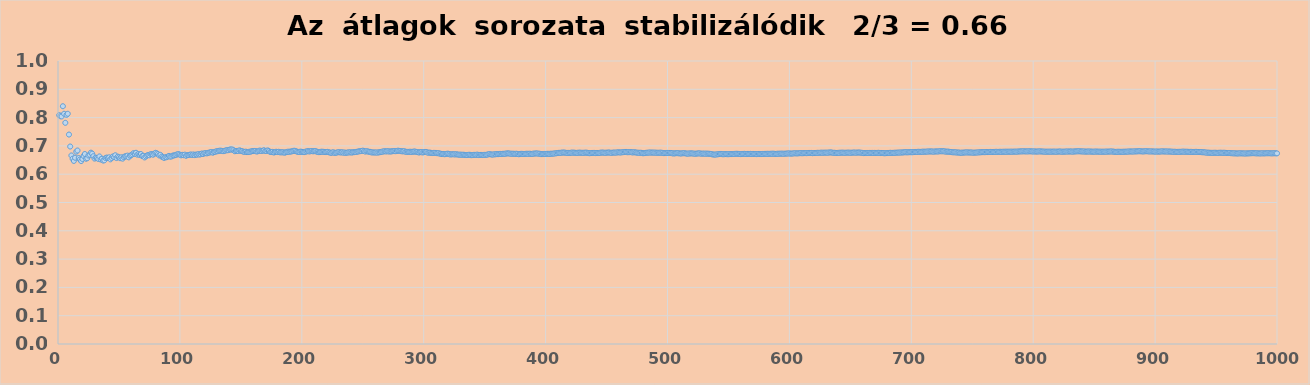
| Category | Series 0 |
|---|---|
| 1.0 | 0.809 |
| 2.0 | 0.805 |
| 3.0 | 0.804 |
| 4.0 | 0.84 |
| 5.0 | 0.814 |
| 6.0 | 0.782 |
| 7.0 | 0.81 |
| 8.0 | 0.814 |
| 9.0 | 0.74 |
| 10.0 | 0.698 |
| 11.0 | 0.666 |
| 12.0 | 0.655 |
| 13.0 | 0.647 |
| 14.0 | 0.658 |
| 15.0 | 0.68 |
| 16.0 | 0.684 |
| 17.0 | 0.657 |
| 18.0 | 0.652 |
| 19.0 | 0.646 |
| 20.0 | 0.654 |
| 21.0 | 0.664 |
| 22.0 | 0.671 |
| 23.0 | 0.655 |
| 24.0 | 0.656 |
| 25.0 | 0.666 |
| 26.0 | 0.669 |
| 27.0 | 0.676 |
| 28.0 | 0.673 |
| 29.0 | 0.663 |
| 30.0 | 0.655 |
| 31.0 | 0.658 |
| 32.0 | 0.657 |
| 33.0 | 0.654 |
| 34.0 | 0.663 |
| 35.0 | 0.652 |
| 36.0 | 0.655 |
| 37.0 | 0.648 |
| 38.0 | 0.649 |
| 39.0 | 0.657 |
| 40.0 | 0.659 |
| 41.0 | 0.657 |
| 42.0 | 0.66 |
| 43.0 | 0.652 |
| 44.0 | 0.657 |
| 45.0 | 0.663 |
| 46.0 | 0.66 |
| 47.0 | 0.667 |
| 48.0 | 0.657 |
| 49.0 | 0.662 |
| 50.0 | 0.66 |
| 51.0 | 0.657 |
| 52.0 | 0.66 |
| 53.0 | 0.655 |
| 54.0 | 0.66 |
| 55.0 | 0.663 |
| 56.0 | 0.663 |
| 57.0 | 0.666 |
| 58.0 | 0.66 |
| 59.0 | 0.665 |
| 60.0 | 0.667 |
| 61.0 | 0.67 |
| 62.0 | 0.674 |
| 63.0 | 0.672 |
| 64.0 | 0.676 |
| 65.0 | 0.669 |
| 66.0 | 0.671 |
| 67.0 | 0.668 |
| 68.0 | 0.671 |
| 69.0 | 0.664 |
| 70.0 | 0.665 |
| 71.0 | 0.659 |
| 72.0 | 0.663 |
| 73.0 | 0.666 |
| 74.0 | 0.668 |
| 75.0 | 0.667 |
| 76.0 | 0.671 |
| 77.0 | 0.671 |
| 78.0 | 0.669 |
| 79.0 | 0.673 |
| 80.0 | 0.676 |
| 81.0 | 0.674 |
| 82.0 | 0.671 |
| 83.0 | 0.666 |
| 84.0 | 0.668 |
| 85.0 | 0.662 |
| 86.0 | 0.66 |
| 87.0 | 0.658 |
| 88.0 | 0.66 |
| 89.0 | 0.66 |
| 90.0 | 0.662 |
| 91.0 | 0.664 |
| 92.0 | 0.662 |
| 93.0 | 0.663 |
| 94.0 | 0.665 |
| 95.0 | 0.666 |
| 96.0 | 0.667 |
| 97.0 | 0.669 |
| 98.0 | 0.67 |
| 99.0 | 0.671 |
| 100.0 | 0.669 |
| 101.0 | 0.667 |
| 102.0 | 0.668 |
| 103.0 | 0.667 |
| 104.0 | 0.669 |
| 105.0 | 0.665 |
| 106.0 | 0.667 |
| 107.0 | 0.668 |
| 108.0 | 0.669 |
| 109.0 | 0.67 |
| 110.0 | 0.668 |
| 111.0 | 0.67 |
| 112.0 | 0.667 |
| 113.0 | 0.669 |
| 114.0 | 0.669 |
| 115.0 | 0.671 |
| 116.0 | 0.669 |
| 117.0 | 0.671 |
| 118.0 | 0.673 |
| 119.0 | 0.671 |
| 120.0 | 0.674 |
| 121.0 | 0.674 |
| 122.0 | 0.674 |
| 123.0 | 0.675 |
| 124.0 | 0.676 |
| 125.0 | 0.678 |
| 126.0 | 0.678 |
| 127.0 | 0.676 |
| 128.0 | 0.678 |
| 129.0 | 0.679 |
| 130.0 | 0.681 |
| 131.0 | 0.681 |
| 132.0 | 0.683 |
| 133.0 | 0.683 |
| 134.0 | 0.683 |
| 135.0 | 0.682 |
| 136.0 | 0.682 |
| 137.0 | 0.683 |
| 138.0 | 0.685 |
| 139.0 | 0.685 |
| 140.0 | 0.685 |
| 141.0 | 0.687 |
| 142.0 | 0.687 |
| 143.0 | 0.687 |
| 144.0 | 0.685 |
| 145.0 | 0.681 |
| 146.0 | 0.682 |
| 147.0 | 0.682 |
| 148.0 | 0.682 |
| 149.0 | 0.684 |
| 150.0 | 0.682 |
| 151.0 | 0.681 |
| 152.0 | 0.68 |
| 153.0 | 0.679 |
| 154.0 | 0.68 |
| 155.0 | 0.678 |
| 156.0 | 0.678 |
| 157.0 | 0.679 |
| 158.0 | 0.68 |
| 159.0 | 0.681 |
| 160.0 | 0.682 |
| 161.0 | 0.682 |
| 162.0 | 0.682 |
| 163.0 | 0.68 |
| 164.0 | 0.681 |
| 165.0 | 0.683 |
| 166.0 | 0.683 |
| 167.0 | 0.682 |
| 168.0 | 0.683 |
| 169.0 | 0.685 |
| 170.0 | 0.682 |
| 171.0 | 0.682 |
| 172.0 | 0.684 |
| 173.0 | 0.682 |
| 174.0 | 0.679 |
| 175.0 | 0.678 |
| 176.0 | 0.679 |
| 177.0 | 0.677 |
| 178.0 | 0.678 |
| 179.0 | 0.679 |
| 180.0 | 0.678 |
| 181.0 | 0.679 |
| 182.0 | 0.677 |
| 183.0 | 0.677 |
| 184.0 | 0.677 |
| 185.0 | 0.677 |
| 186.0 | 0.676 |
| 187.0 | 0.678 |
| 188.0 | 0.679 |
| 189.0 | 0.68 |
| 190.0 | 0.679 |
| 191.0 | 0.68 |
| 192.0 | 0.681 |
| 193.0 | 0.682 |
| 194.0 | 0.683 |
| 195.0 | 0.682 |
| 196.0 | 0.68 |
| 197.0 | 0.679 |
| 198.0 | 0.679 |
| 199.0 | 0.68 |
| 200.0 | 0.679 |
| 201.0 | 0.679 |
| 202.0 | 0.678 |
| 203.0 | 0.679 |
| 204.0 | 0.68 |
| 205.0 | 0.682 |
| 206.0 | 0.68 |
| 207.0 | 0.681 |
| 208.0 | 0.682 |
| 209.0 | 0.681 |
| 210.0 | 0.681 |
| 211.0 | 0.682 |
| 212.0 | 0.68 |
| 213.0 | 0.679 |
| 214.0 | 0.678 |
| 215.0 | 0.678 |
| 216.0 | 0.68 |
| 217.0 | 0.679 |
| 218.0 | 0.679 |
| 219.0 | 0.678 |
| 220.0 | 0.678 |
| 221.0 | 0.679 |
| 222.0 | 0.678 |
| 223.0 | 0.677 |
| 224.0 | 0.675 |
| 225.0 | 0.677 |
| 226.0 | 0.677 |
| 227.0 | 0.675 |
| 228.0 | 0.676 |
| 229.0 | 0.677 |
| 230.0 | 0.678 |
| 231.0 | 0.678 |
| 232.0 | 0.677 |
| 233.0 | 0.678 |
| 234.0 | 0.676 |
| 235.0 | 0.677 |
| 236.0 | 0.675 |
| 237.0 | 0.676 |
| 238.0 | 0.677 |
| 239.0 | 0.677 |
| 240.0 | 0.678 |
| 241.0 | 0.676 |
| 242.0 | 0.678 |
| 243.0 | 0.678 |
| 244.0 | 0.679 |
| 245.0 | 0.679 |
| 246.0 | 0.68 |
| 247.0 | 0.681 |
| 248.0 | 0.681 |
| 249.0 | 0.682 |
| 250.0 | 0.683 |
| 251.0 | 0.682 |
| 252.0 | 0.68 |
| 253.0 | 0.681 |
| 254.0 | 0.681 |
| 255.0 | 0.679 |
| 256.0 | 0.679 |
| 257.0 | 0.677 |
| 258.0 | 0.677 |
| 259.0 | 0.677 |
| 260.0 | 0.677 |
| 261.0 | 0.677 |
| 262.0 | 0.676 |
| 263.0 | 0.677 |
| 264.0 | 0.678 |
| 265.0 | 0.679 |
| 266.0 | 0.68 |
| 267.0 | 0.68 |
| 268.0 | 0.681 |
| 269.0 | 0.68 |
| 270.0 | 0.681 |
| 271.0 | 0.681 |
| 272.0 | 0.68 |
| 273.0 | 0.68 |
| 274.0 | 0.681 |
| 275.0 | 0.682 |
| 276.0 | 0.682 |
| 277.0 | 0.681 |
| 278.0 | 0.682 |
| 279.0 | 0.683 |
| 280.0 | 0.682 |
| 281.0 | 0.682 |
| 282.0 | 0.681 |
| 283.0 | 0.681 |
| 284.0 | 0.681 |
| 285.0 | 0.679 |
| 286.0 | 0.679 |
| 287.0 | 0.679 |
| 288.0 | 0.679 |
| 289.0 | 0.679 |
| 290.0 | 0.679 |
| 291.0 | 0.679 |
| 292.0 | 0.68 |
| 293.0 | 0.68 |
| 294.0 | 0.679 |
| 295.0 | 0.678 |
| 296.0 | 0.677 |
| 297.0 | 0.678 |
| 298.0 | 0.678 |
| 299.0 | 0.677 |
| 300.0 | 0.678 |
| 301.0 | 0.679 |
| 302.0 | 0.679 |
| 303.0 | 0.677 |
| 304.0 | 0.676 |
| 305.0 | 0.676 |
| 306.0 | 0.676 |
| 307.0 | 0.675 |
| 308.0 | 0.675 |
| 309.0 | 0.675 |
| 310.0 | 0.675 |
| 311.0 | 0.674 |
| 312.0 | 0.674 |
| 313.0 | 0.673 |
| 314.0 | 0.672 |
| 315.0 | 0.671 |
| 316.0 | 0.671 |
| 317.0 | 0.671 |
| 318.0 | 0.671 |
| 319.0 | 0.672 |
| 320.0 | 0.672 |
| 321.0 | 0.671 |
| 322.0 | 0.67 |
| 323.0 | 0.67 |
| 324.0 | 0.671 |
| 325.0 | 0.67 |
| 326.0 | 0.67 |
| 327.0 | 0.671 |
| 328.0 | 0.669 |
| 329.0 | 0.669 |
| 330.0 | 0.669 |
| 331.0 | 0.669 |
| 332.0 | 0.669 |
| 333.0 | 0.669 |
| 334.0 | 0.668 |
| 335.0 | 0.668 |
| 336.0 | 0.668 |
| 337.0 | 0.669 |
| 338.0 | 0.669 |
| 339.0 | 0.667 |
| 340.0 | 0.668 |
| 341.0 | 0.668 |
| 342.0 | 0.668 |
| 343.0 | 0.668 |
| 344.0 | 0.669 |
| 345.0 | 0.668 |
| 346.0 | 0.668 |
| 347.0 | 0.668 |
| 348.0 | 0.668 |
| 349.0 | 0.668 |
| 350.0 | 0.668 |
| 351.0 | 0.668 |
| 352.0 | 0.669 |
| 353.0 | 0.67 |
| 354.0 | 0.671 |
| 355.0 | 0.67 |
| 356.0 | 0.669 |
| 357.0 | 0.67 |
| 358.0 | 0.67 |
| 359.0 | 0.67 |
| 360.0 | 0.671 |
| 361.0 | 0.671 |
| 362.0 | 0.672 |
| 363.0 | 0.672 |
| 364.0 | 0.671 |
| 365.0 | 0.672 |
| 366.0 | 0.672 |
| 367.0 | 0.672 |
| 368.0 | 0.673 |
| 369.0 | 0.674 |
| 370.0 | 0.673 |
| 371.0 | 0.672 |
| 372.0 | 0.672 |
| 373.0 | 0.672 |
| 374.0 | 0.672 |
| 375.0 | 0.672 |
| 376.0 | 0.672 |
| 377.0 | 0.672 |
| 378.0 | 0.67 |
| 379.0 | 0.671 |
| 380.0 | 0.672 |
| 381.0 | 0.672 |
| 382.0 | 0.671 |
| 383.0 | 0.672 |
| 384.0 | 0.672 |
| 385.0 | 0.672 |
| 386.0 | 0.672 |
| 387.0 | 0.672 |
| 388.0 | 0.672 |
| 389.0 | 0.672 |
| 390.0 | 0.673 |
| 391.0 | 0.673 |
| 392.0 | 0.673 |
| 393.0 | 0.673 |
| 394.0 | 0.673 |
| 395.0 | 0.672 |
| 396.0 | 0.671 |
| 397.0 | 0.671 |
| 398.0 | 0.671 |
| 399.0 | 0.672 |
| 400.0 | 0.672 |
| 401.0 | 0.672 |
| 402.0 | 0.672 |
| 403.0 | 0.672 |
| 404.0 | 0.672 |
| 405.0 | 0.672 |
| 406.0 | 0.673 |
| 407.0 | 0.673 |
| 408.0 | 0.673 |
| 409.0 | 0.674 |
| 410.0 | 0.675 |
| 411.0 | 0.676 |
| 412.0 | 0.675 |
| 413.0 | 0.676 |
| 414.0 | 0.677 |
| 415.0 | 0.676 |
| 416.0 | 0.676 |
| 417.0 | 0.675 |
| 418.0 | 0.675 |
| 419.0 | 0.675 |
| 420.0 | 0.675 |
| 421.0 | 0.676 |
| 422.0 | 0.676 |
| 423.0 | 0.676 |
| 424.0 | 0.676 |
| 425.0 | 0.675 |
| 426.0 | 0.675 |
| 427.0 | 0.676 |
| 428.0 | 0.676 |
| 429.0 | 0.676 |
| 430.0 | 0.676 |
| 431.0 | 0.676 |
| 432.0 | 0.676 |
| 433.0 | 0.676 |
| 434.0 | 0.676 |
| 435.0 | 0.675 |
| 436.0 | 0.674 |
| 437.0 | 0.675 |
| 438.0 | 0.675 |
| 439.0 | 0.675 |
| 440.0 | 0.675 |
| 441.0 | 0.675 |
| 442.0 | 0.675 |
| 443.0 | 0.675 |
| 444.0 | 0.675 |
| 445.0 | 0.676 |
| 446.0 | 0.677 |
| 447.0 | 0.676 |
| 448.0 | 0.676 |
| 449.0 | 0.676 |
| 450.0 | 0.676 |
| 451.0 | 0.676 |
| 452.0 | 0.677 |
| 453.0 | 0.676 |
| 454.0 | 0.676 |
| 455.0 | 0.676 |
| 456.0 | 0.676 |
| 457.0 | 0.676 |
| 458.0 | 0.677 |
| 459.0 | 0.677 |
| 460.0 | 0.678 |
| 461.0 | 0.677 |
| 462.0 | 0.677 |
| 463.0 | 0.678 |
| 464.0 | 0.678 |
| 465.0 | 0.678 |
| 466.0 | 0.679 |
| 467.0 | 0.678 |
| 468.0 | 0.678 |
| 469.0 | 0.678 |
| 470.0 | 0.678 |
| 471.0 | 0.677 |
| 472.0 | 0.677 |
| 473.0 | 0.678 |
| 474.0 | 0.677 |
| 475.0 | 0.676 |
| 476.0 | 0.676 |
| 477.0 | 0.676 |
| 478.0 | 0.676 |
| 479.0 | 0.675 |
| 480.0 | 0.674 |
| 481.0 | 0.675 |
| 482.0 | 0.675 |
| 483.0 | 0.676 |
| 484.0 | 0.676 |
| 485.0 | 0.677 |
| 486.0 | 0.677 |
| 487.0 | 0.676 |
| 488.0 | 0.676 |
| 489.0 | 0.676 |
| 490.0 | 0.676 |
| 491.0 | 0.676 |
| 492.0 | 0.676 |
| 493.0 | 0.676 |
| 494.0 | 0.676 |
| 495.0 | 0.676 |
| 496.0 | 0.675 |
| 497.0 | 0.674 |
| 498.0 | 0.675 |
| 499.0 | 0.675 |
| 500.0 | 0.675 |
| 501.0 | 0.675 |
| 502.0 | 0.675 |
| 503.0 | 0.675 |
| 504.0 | 0.674 |
| 505.0 | 0.673 |
| 506.0 | 0.674 |
| 507.0 | 0.674 |
| 508.0 | 0.674 |
| 509.0 | 0.674 |
| 510.0 | 0.673 |
| 511.0 | 0.673 |
| 512.0 | 0.674 |
| 513.0 | 0.674 |
| 514.0 | 0.674 |
| 515.0 | 0.673 |
| 516.0 | 0.673 |
| 517.0 | 0.673 |
| 518.0 | 0.673 |
| 519.0 | 0.674 |
| 520.0 | 0.674 |
| 521.0 | 0.673 |
| 522.0 | 0.673 |
| 523.0 | 0.672 |
| 524.0 | 0.673 |
| 525.0 | 0.673 |
| 526.0 | 0.674 |
| 527.0 | 0.673 |
| 528.0 | 0.672 |
| 529.0 | 0.673 |
| 530.0 | 0.673 |
| 531.0 | 0.672 |
| 532.0 | 0.673 |
| 533.0 | 0.672 |
| 534.0 | 0.672 |
| 535.0 | 0.672 |
| 536.0 | 0.671 |
| 537.0 | 0.67 |
| 538.0 | 0.669 |
| 539.0 | 0.669 |
| 540.0 | 0.67 |
| 541.0 | 0.67 |
| 542.0 | 0.671 |
| 543.0 | 0.671 |
| 544.0 | 0.672 |
| 545.0 | 0.671 |
| 546.0 | 0.671 |
| 547.0 | 0.671 |
| 548.0 | 0.671 |
| 549.0 | 0.671 |
| 550.0 | 0.671 |
| 551.0 | 0.671 |
| 552.0 | 0.671 |
| 553.0 | 0.671 |
| 554.0 | 0.671 |
| 555.0 | 0.672 |
| 556.0 | 0.672 |
| 557.0 | 0.672 |
| 558.0 | 0.672 |
| 559.0 | 0.671 |
| 560.0 | 0.671 |
| 561.0 | 0.671 |
| 562.0 | 0.672 |
| 563.0 | 0.672 |
| 564.0 | 0.671 |
| 565.0 | 0.671 |
| 566.0 | 0.672 |
| 567.0 | 0.671 |
| 568.0 | 0.672 |
| 569.0 | 0.671 |
| 570.0 | 0.671 |
| 571.0 | 0.671 |
| 572.0 | 0.671 |
| 573.0 | 0.671 |
| 574.0 | 0.671 |
| 575.0 | 0.672 |
| 576.0 | 0.671 |
| 577.0 | 0.671 |
| 578.0 | 0.672 |
| 579.0 | 0.671 |
| 580.0 | 0.672 |
| 581.0 | 0.672 |
| 582.0 | 0.672 |
| 583.0 | 0.672 |
| 584.0 | 0.672 |
| 585.0 | 0.672 |
| 586.0 | 0.672 |
| 587.0 | 0.672 |
| 588.0 | 0.672 |
| 589.0 | 0.672 |
| 590.0 | 0.672 |
| 591.0 | 0.672 |
| 592.0 | 0.673 |
| 593.0 | 0.672 |
| 594.0 | 0.673 |
| 595.0 | 0.672 |
| 596.0 | 0.672 |
| 597.0 | 0.673 |
| 598.0 | 0.673 |
| 599.0 | 0.673 |
| 600.0 | 0.673 |
| 601.0 | 0.673 |
| 602.0 | 0.673 |
| 603.0 | 0.673 |
| 604.0 | 0.674 |
| 605.0 | 0.674 |
| 606.0 | 0.673 |
| 607.0 | 0.674 |
| 608.0 | 0.674 |
| 609.0 | 0.674 |
| 610.0 | 0.674 |
| 611.0 | 0.674 |
| 612.0 | 0.674 |
| 613.0 | 0.675 |
| 614.0 | 0.674 |
| 615.0 | 0.675 |
| 616.0 | 0.675 |
| 617.0 | 0.675 |
| 618.0 | 0.675 |
| 619.0 | 0.674 |
| 620.0 | 0.675 |
| 621.0 | 0.675 |
| 622.0 | 0.675 |
| 623.0 | 0.676 |
| 624.0 | 0.675 |
| 625.0 | 0.676 |
| 626.0 | 0.676 |
| 627.0 | 0.676 |
| 628.0 | 0.676 |
| 629.0 | 0.676 |
| 630.0 | 0.676 |
| 631.0 | 0.676 |
| 632.0 | 0.676 |
| 633.0 | 0.677 |
| 634.0 | 0.677 |
| 635.0 | 0.676 |
| 636.0 | 0.676 |
| 637.0 | 0.676 |
| 638.0 | 0.675 |
| 639.0 | 0.675 |
| 640.0 | 0.675 |
| 641.0 | 0.676 |
| 642.0 | 0.676 |
| 643.0 | 0.676 |
| 644.0 | 0.676 |
| 645.0 | 0.676 |
| 646.0 | 0.676 |
| 647.0 | 0.676 |
| 648.0 | 0.676 |
| 649.0 | 0.676 |
| 650.0 | 0.676 |
| 651.0 | 0.676 |
| 652.0 | 0.676 |
| 653.0 | 0.677 |
| 654.0 | 0.676 |
| 655.0 | 0.676 |
| 656.0 | 0.676 |
| 657.0 | 0.677 |
| 658.0 | 0.676 |
| 659.0 | 0.676 |
| 660.0 | 0.675 |
| 661.0 | 0.674 |
| 662.0 | 0.675 |
| 663.0 | 0.675 |
| 664.0 | 0.675 |
| 665.0 | 0.675 |
| 666.0 | 0.675 |
| 667.0 | 0.675 |
| 668.0 | 0.675 |
| 669.0 | 0.675 |
| 670.0 | 0.675 |
| 671.0 | 0.675 |
| 672.0 | 0.675 |
| 673.0 | 0.676 |
| 674.0 | 0.675 |
| 675.0 | 0.675 |
| 676.0 | 0.675 |
| 677.0 | 0.674 |
| 678.0 | 0.674 |
| 679.0 | 0.674 |
| 680.0 | 0.675 |
| 681.0 | 0.675 |
| 682.0 | 0.675 |
| 683.0 | 0.676 |
| 684.0 | 0.675 |
| 685.0 | 0.676 |
| 686.0 | 0.676 |
| 687.0 | 0.676 |
| 688.0 | 0.676 |
| 689.0 | 0.676 |
| 690.0 | 0.676 |
| 691.0 | 0.677 |
| 692.0 | 0.677 |
| 693.0 | 0.677 |
| 694.0 | 0.677 |
| 695.0 | 0.678 |
| 696.0 | 0.677 |
| 697.0 | 0.677 |
| 698.0 | 0.678 |
| 699.0 | 0.678 |
| 700.0 | 0.678 |
| 701.0 | 0.678 |
| 702.0 | 0.678 |
| 703.0 | 0.678 |
| 704.0 | 0.679 |
| 705.0 | 0.679 |
| 706.0 | 0.679 |
| 707.0 | 0.679 |
| 708.0 | 0.679 |
| 709.0 | 0.679 |
| 710.0 | 0.68 |
| 711.0 | 0.679 |
| 712.0 | 0.68 |
| 713.0 | 0.68 |
| 714.0 | 0.68 |
| 715.0 | 0.68 |
| 716.0 | 0.68 |
| 717.0 | 0.68 |
| 718.0 | 0.68 |
| 719.0 | 0.68 |
| 720.0 | 0.68 |
| 721.0 | 0.68 |
| 722.0 | 0.68 |
| 723.0 | 0.681 |
| 724.0 | 0.681 |
| 725.0 | 0.681 |
| 726.0 | 0.681 |
| 727.0 | 0.681 |
| 728.0 | 0.68 |
| 729.0 | 0.68 |
| 730.0 | 0.68 |
| 731.0 | 0.679 |
| 732.0 | 0.679 |
| 733.0 | 0.678 |
| 734.0 | 0.677 |
| 735.0 | 0.677 |
| 736.0 | 0.677 |
| 737.0 | 0.677 |
| 738.0 | 0.676 |
| 739.0 | 0.677 |
| 740.0 | 0.676 |
| 741.0 | 0.676 |
| 742.0 | 0.676 |
| 743.0 | 0.676 |
| 744.0 | 0.677 |
| 745.0 | 0.677 |
| 746.0 | 0.677 |
| 747.0 | 0.677 |
| 748.0 | 0.677 |
| 749.0 | 0.677 |
| 750.0 | 0.676 |
| 751.0 | 0.676 |
| 752.0 | 0.676 |
| 753.0 | 0.676 |
| 754.0 | 0.677 |
| 755.0 | 0.677 |
| 756.0 | 0.677 |
| 757.0 | 0.678 |
| 758.0 | 0.678 |
| 759.0 | 0.678 |
| 760.0 | 0.678 |
| 761.0 | 0.678 |
| 762.0 | 0.678 |
| 763.0 | 0.678 |
| 764.0 | 0.679 |
| 765.0 | 0.679 |
| 766.0 | 0.679 |
| 767.0 | 0.679 |
| 768.0 | 0.679 |
| 769.0 | 0.679 |
| 770.0 | 0.679 |
| 771.0 | 0.679 |
| 772.0 | 0.679 |
| 773.0 | 0.679 |
| 774.0 | 0.679 |
| 775.0 | 0.679 |
| 776.0 | 0.679 |
| 777.0 | 0.679 |
| 778.0 | 0.679 |
| 779.0 | 0.68 |
| 780.0 | 0.679 |
| 781.0 | 0.68 |
| 782.0 | 0.68 |
| 783.0 | 0.68 |
| 784.0 | 0.68 |
| 785.0 | 0.68 |
| 786.0 | 0.68 |
| 787.0 | 0.68 |
| 788.0 | 0.68 |
| 789.0 | 0.68 |
| 790.0 | 0.681 |
| 791.0 | 0.681 |
| 792.0 | 0.681 |
| 793.0 | 0.681 |
| 794.0 | 0.681 |
| 795.0 | 0.681 |
| 796.0 | 0.681 |
| 797.0 | 0.681 |
| 798.0 | 0.681 |
| 799.0 | 0.681 |
| 800.0 | 0.68 |
| 801.0 | 0.681 |
| 802.0 | 0.68 |
| 803.0 | 0.68 |
| 804.0 | 0.68 |
| 805.0 | 0.68 |
| 806.0 | 0.681 |
| 807.0 | 0.68 |
| 808.0 | 0.68 |
| 809.0 | 0.68 |
| 810.0 | 0.68 |
| 811.0 | 0.679 |
| 812.0 | 0.68 |
| 813.0 | 0.68 |
| 814.0 | 0.68 |
| 815.0 | 0.68 |
| 816.0 | 0.68 |
| 817.0 | 0.68 |
| 818.0 | 0.68 |
| 819.0 | 0.68 |
| 820.0 | 0.68 |
| 821.0 | 0.68 |
| 822.0 | 0.68 |
| 823.0 | 0.68 |
| 824.0 | 0.68 |
| 825.0 | 0.68 |
| 826.0 | 0.68 |
| 827.0 | 0.68 |
| 828.0 | 0.68 |
| 829.0 | 0.68 |
| 830.0 | 0.68 |
| 831.0 | 0.68 |
| 832.0 | 0.68 |
| 833.0 | 0.68 |
| 834.0 | 0.68 |
| 835.0 | 0.681 |
| 836.0 | 0.681 |
| 837.0 | 0.681 |
| 838.0 | 0.681 |
| 839.0 | 0.681 |
| 840.0 | 0.681 |
| 841.0 | 0.68 |
| 842.0 | 0.68 |
| 843.0 | 0.68 |
| 844.0 | 0.68 |
| 845.0 | 0.68 |
| 846.0 | 0.68 |
| 847.0 | 0.68 |
| 848.0 | 0.68 |
| 849.0 | 0.679 |
| 850.0 | 0.68 |
| 851.0 | 0.68 |
| 852.0 | 0.68 |
| 853.0 | 0.68 |
| 854.0 | 0.68 |
| 855.0 | 0.68 |
| 856.0 | 0.68 |
| 857.0 | 0.679 |
| 858.0 | 0.679 |
| 859.0 | 0.68 |
| 860.0 | 0.68 |
| 861.0 | 0.68 |
| 862.0 | 0.68 |
| 863.0 | 0.68 |
| 864.0 | 0.68 |
| 865.0 | 0.68 |
| 866.0 | 0.68 |
| 867.0 | 0.679 |
| 868.0 | 0.679 |
| 869.0 | 0.679 |
| 870.0 | 0.679 |
| 871.0 | 0.679 |
| 872.0 | 0.679 |
| 873.0 | 0.679 |
| 874.0 | 0.679 |
| 875.0 | 0.68 |
| 876.0 | 0.679 |
| 877.0 | 0.68 |
| 878.0 | 0.68 |
| 879.0 | 0.68 |
| 880.0 | 0.68 |
| 881.0 | 0.68 |
| 882.0 | 0.68 |
| 883.0 | 0.68 |
| 884.0 | 0.681 |
| 885.0 | 0.681 |
| 886.0 | 0.681 |
| 887.0 | 0.681 |
| 888.0 | 0.681 |
| 889.0 | 0.681 |
| 890.0 | 0.681 |
| 891.0 | 0.681 |
| 892.0 | 0.681 |
| 893.0 | 0.681 |
| 894.0 | 0.681 |
| 895.0 | 0.68 |
| 896.0 | 0.681 |
| 897.0 | 0.68 |
| 898.0 | 0.68 |
| 899.0 | 0.68 |
| 900.0 | 0.68 |
| 901.0 | 0.68 |
| 902.0 | 0.68 |
| 903.0 | 0.68 |
| 904.0 | 0.68 |
| 905.0 | 0.68 |
| 906.0 | 0.681 |
| 907.0 | 0.68 |
| 908.0 | 0.68 |
| 909.0 | 0.68 |
| 910.0 | 0.68 |
| 911.0 | 0.68 |
| 912.0 | 0.68 |
| 913.0 | 0.68 |
| 914.0 | 0.68 |
| 915.0 | 0.679 |
| 916.0 | 0.679 |
| 917.0 | 0.679 |
| 918.0 | 0.679 |
| 919.0 | 0.679 |
| 920.0 | 0.679 |
| 921.0 | 0.679 |
| 922.0 | 0.679 |
| 923.0 | 0.68 |
| 924.0 | 0.68 |
| 925.0 | 0.679 |
| 926.0 | 0.679 |
| 927.0 | 0.679 |
| 928.0 | 0.679 |
| 929.0 | 0.679 |
| 930.0 | 0.679 |
| 931.0 | 0.679 |
| 932.0 | 0.679 |
| 933.0 | 0.679 |
| 934.0 | 0.679 |
| 935.0 | 0.679 |
| 936.0 | 0.679 |
| 937.0 | 0.678 |
| 938.0 | 0.678 |
| 939.0 | 0.677 |
| 940.0 | 0.678 |
| 941.0 | 0.677 |
| 942.0 | 0.676 |
| 943.0 | 0.676 |
| 944.0 | 0.676 |
| 945.0 | 0.676 |
| 946.0 | 0.676 |
| 947.0 | 0.676 |
| 948.0 | 0.676 |
| 949.0 | 0.676 |
| 950.0 | 0.676 |
| 951.0 | 0.675 |
| 952.0 | 0.676 |
| 953.0 | 0.676 |
| 954.0 | 0.676 |
| 955.0 | 0.675 |
| 956.0 | 0.676 |
| 957.0 | 0.676 |
| 958.0 | 0.675 |
| 959.0 | 0.675 |
| 960.0 | 0.675 |
| 961.0 | 0.675 |
| 962.0 | 0.674 |
| 963.0 | 0.674 |
| 964.0 | 0.674 |
| 965.0 | 0.674 |
| 966.0 | 0.674 |
| 967.0 | 0.673 |
| 968.0 | 0.673 |
| 969.0 | 0.674 |
| 970.0 | 0.674 |
| 971.0 | 0.674 |
| 972.0 | 0.674 |
| 973.0 | 0.673 |
| 974.0 | 0.673 |
| 975.0 | 0.673 |
| 976.0 | 0.674 |
| 977.0 | 0.674 |
| 978.0 | 0.674 |
| 979.0 | 0.674 |
| 980.0 | 0.674 |
| 981.0 | 0.674 |
| 982.0 | 0.674 |
| 983.0 | 0.674 |
| 984.0 | 0.674 |
| 985.0 | 0.674 |
| 986.0 | 0.673 |
| 987.0 | 0.674 |
| 988.0 | 0.674 |
| 989.0 | 0.673 |
| 990.0 | 0.674 |
| 991.0 | 0.674 |
| 992.0 | 0.674 |
| 993.0 | 0.674 |
| 994.0 | 0.674 |
| 995.0 | 0.674 |
| 996.0 | 0.674 |
| 997.0 | 0.674 |
| 998.0 | 0.674 |
| 999.0 | 0.674 |
| 1000.0 | 0.674 |